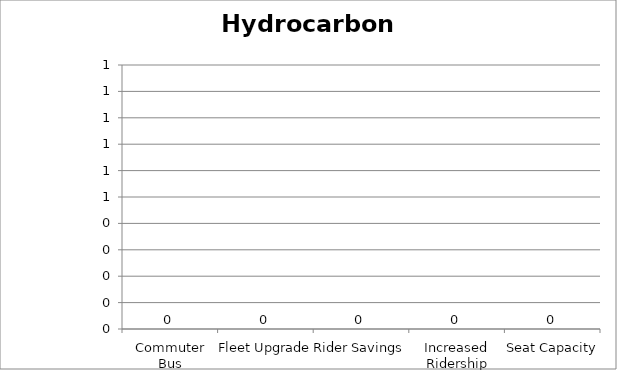
| Category | Hydrocarbons |
|---|---|
| Commuter Bus | 0 |
| Fleet Upgrade | 0 |
| Rider Savings | 0 |
| Increased Ridership | 0 |
| Seat Capacity | 0 |